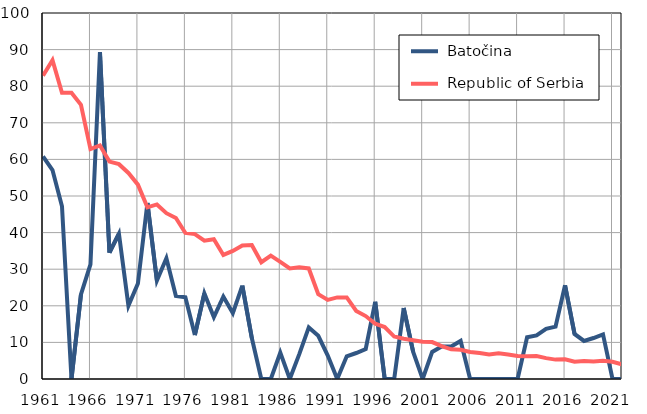
| Category |  Batočina |  Republic of Serbia |
|---|---|---|
| 1961.0 | 60.8 | 82.9 |
| 1962.0 | 57.1 | 87.1 |
| 1963.0 | 47.2 | 78.2 |
| 1964.0 | 0 | 78.2 |
| 1965.0 | 23.1 | 74.9 |
| 1966.0 | 31.3 | 62.8 |
| 1967.0 | 89.3 | 63.8 |
| 1968.0 | 34.5 | 59.4 |
| 1969.0 | 39.7 | 58.7 |
| 1970.0 | 20 | 56.3 |
| 1971.0 | 26.1 | 53.1 |
| 1972.0 | 48.1 | 46.9 |
| 1973.0 | 26.9 | 47.7 |
| 1974.0 | 33 | 45.3 |
| 1975.0 | 22.7 | 44 |
| 1976.0 | 22.3 | 39.9 |
| 1977.0 | 12 | 39.6 |
| 1978.0 | 23.4 | 37.8 |
| 1979.0 | 16.9 | 38.2 |
| 1980.0 | 22.5 | 33.9 |
| 1981.0 | 18 | 35 |
| 1982.0 | 25.5 | 36.5 |
| 1983.0 | 11.2 | 36.6 |
| 1984.0 | 0 | 31.9 |
| 1985.0 | 0 | 33.7 |
| 1986.0 | 7.2 | 32 |
| 1987.0 | 0 | 30.2 |
| 1988.0 | 6.8 | 30.5 |
| 1989.0 | 14.1 | 30.2 |
| 1990.0 | 11.8 | 23.2 |
| 1991.0 | 6.4 | 21.6 |
| 1992.0 | 0 | 22.3 |
| 1993.0 | 6.2 | 22.3 |
| 1994.0 | 7.1 | 18.6 |
| 1995.0 | 8.2 | 17.2 |
| 1996.0 | 21.1 | 15.1 |
| 1997.0 | 0 | 14.2 |
| 1998.0 | 0 | 11.6 |
| 1999.0 | 19.4 | 11 |
| 2000.0 | 7.4 | 10.6 |
| 2001.0 | 0 | 10.2 |
| 2002.0 | 7.4 | 10.1 |
| 2003.0 | 8.9 | 9 |
| 2004.0 | 8.9 | 8.1 |
| 2005.0 | 10.4 | 8 |
| 2006.0 | 0 | 7.4 |
| 2007.0 | 0 | 7.1 |
| 2008.0 | 0 | 6.7 |
| 2009.0 | 0 | 7 |
| 2010.0 | 0 | 6.7 |
| 2011.0 | 0 | 6.3 |
| 2012.0 | 11.4 | 6.2 |
| 2013.0 | 11.9 | 6.3 |
| 2014.0 | 13.7 | 5.7 |
| 2015.0 | 14.3 | 5.3 |
| 2016.0 | 25.6 | 5.4 |
| 2017.0 | 12.3 | 4.7 |
| 2018.0 | 10.4 | 4.9 |
| 2019.0 | 11.2 | 4.8 |
| 2020.0 | 12.2 | 5 |
| 2021.0 | 0 | 4.7 |
| 2022.0 | 0 | 4 |